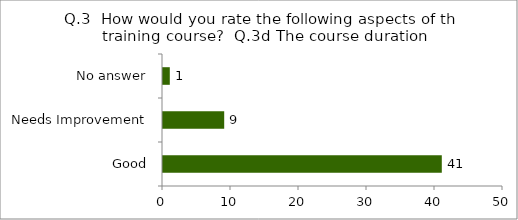
| Category | Q.3  How would you rate the following aspects of the training course?  |
|---|---|
| Good | 41 |
| Needs Improvement | 9 |
| No answer | 1 |